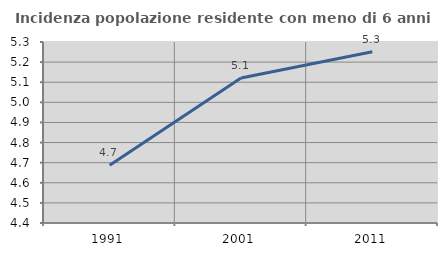
| Category | Incidenza popolazione residente con meno di 6 anni |
|---|---|
| 1991.0 | 4.688 |
| 2001.0 | 5.121 |
| 2011.0 | 5.252 |